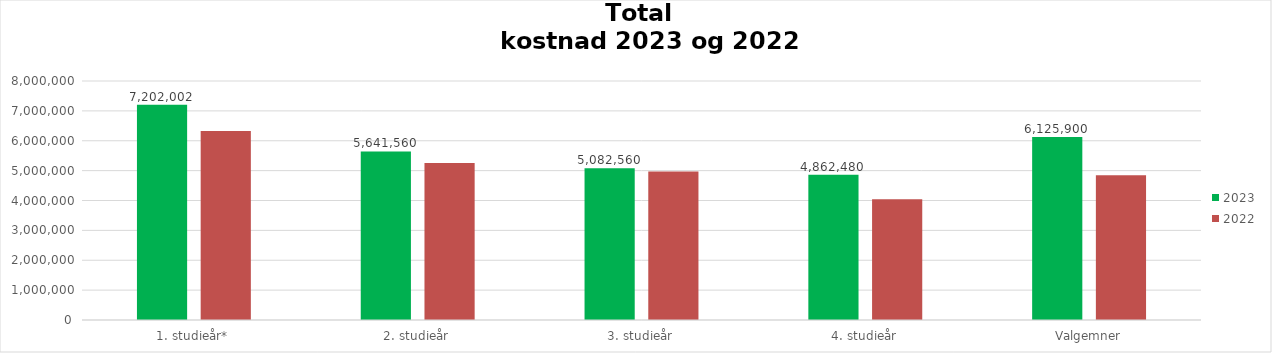
| Category | 2023 | 2022 |
|---|---|---|
| 1. studieår* | 7202001.568 | 6325753.632 |
| 2. studieår | 5641560 | 5251900 |
| 3. studieår | 5082560 | 4969900 |
| 4. studieår | 4862480 | 4045000 |
| Valgemner | 6125900 | 4845900 |